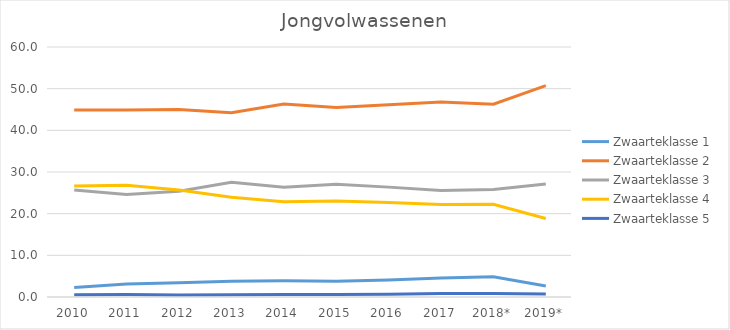
| Category | Zwaarteklasse 1 | Zwaarteklasse 2 | Zwaarteklasse 3 | Zwaarteklasse 4 | Zwaarteklasse 5 |
|---|---|---|---|---|---|
| 2010 | 2.272 | 44.87 | 25.676 | 26.623 | 0.559 |
| 2011 | 3.116 | 44.863 | 24.592 | 26.839 | 0.59 |
| 2012 | 3.403 | 45.019 | 25.39 | 25.679 | 0.51 |
| 2013 | 3.777 | 44.242 | 27.539 | 23.927 | 0.515 |
| 2014 | 3.903 | 46.307 | 26.314 | 22.887 | 0.588 |
| 2015 | 3.807 | 45.47 | 27.075 | 23.068 | 0.58 |
| 2016 | 4.104 | 46.167 | 26.37 | 22.679 | 0.679 |
| 2017 | 4.548 | 46.788 | 25.578 | 22.219 | 0.866 |
| 2018* | 4.859 | 46.285 | 25.779 | 22.24 | 0.837 |
| 2019* | 2.618 | 50.718 | 27.093 | 18.857 | 0.713 |